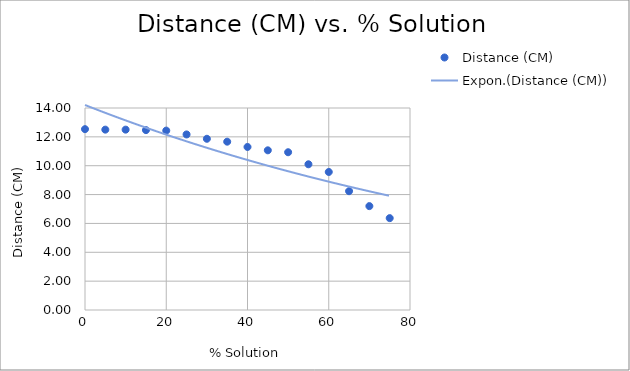
| Category | Distance (CM) |
|---|---|
| 0.0 | 12.533 |
| 5.0 | 12.5 |
| 10.0 | 12.5 |
| 15.0 | 12.467 |
| 20.0 | 12.433 |
| 25.0 | 12.167 |
| 30.0 | 11.867 |
| 35.0 | 11.667 |
| 40.0 | 11.3 |
| 45.0 | 11.067 |
| 50.0 | 10.933 |
| 55.0 | 10.1 |
| 60.0 | 9.567 |
| 65.0 | 8.233 |
| 70.0 | 7.2 |
| 75.0 | 6.367 |